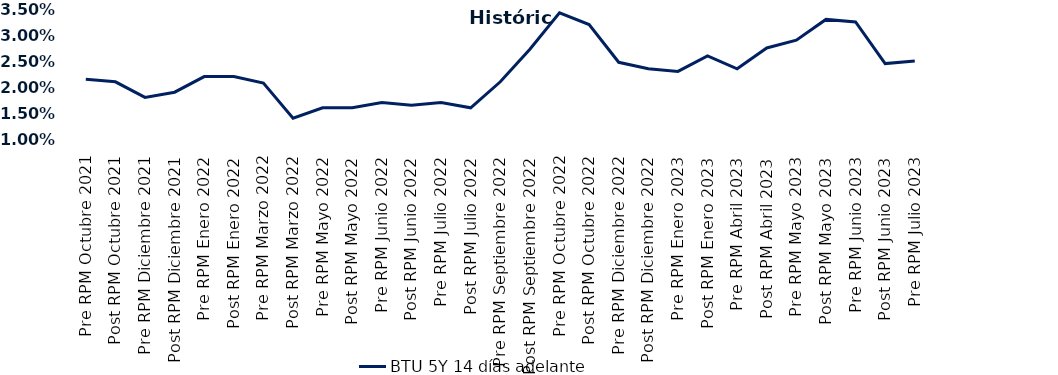
| Category | BTU 5Y 14 días adelante |
|---|---|
| Pre RPM Octubre 2021 | 0.022 |
| Post RPM Octubre 2021 | 0.021 |
| Pre RPM Diciembre 2021 | 0.018 |
| Post RPM Diciembre 2021 | 0.019 |
| Pre RPM Enero 2022 | 0.022 |
| Post RPM Enero 2022 | 0.022 |
| Pre RPM Marzo 2022 | 0.021 |
| Post RPM Marzo 2022 | 0.014 |
| Pre RPM Mayo 2022 | 0.016 |
| Post RPM Mayo 2022 | 0.016 |
| Pre RPM Junio 2022 | 0.017 |
| Post RPM Junio 2022 | 0.016 |
| Pre RPM Julio 2022 | 0.017 |
| Post RPM Julio 2022 | 0.016 |
| Pre RPM Septiembre 2022 | 0.021 |
| Post RPM Septiembre 2022 | 0.027 |
| Pre RPM Octubre 2022 | 0.034 |
| Post RPM Octubre 2022 | 0.032 |
| Pre RPM Diciembre 2022 | 0.025 |
| Post RPM Diciembre 2022 | 0.024 |
| Pre RPM Enero 2023 | 0.023 |
| Post RPM Enero 2023 | 0.026 |
| Pre RPM Abril 2023 | 0.024 |
| Post RPM Abril 2023 | 0.028 |
| Pre RPM Mayo 2023 | 0.029 |
| Post RPM Mayo 2023 | 0.033 |
| Pre RPM Junio 2023 | 0.032 |
| Post RPM Junio 2023 | 0.024 |
| Pre RPM Julio 2023 | 0.025 |